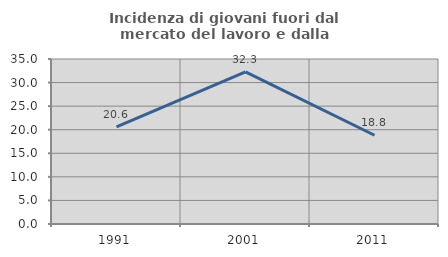
| Category | Incidenza di giovani fuori dal mercato del lavoro e dalla formazione  |
|---|---|
| 1991.0 | 20.625 |
| 2001.0 | 32.268 |
| 2011.0 | 18.831 |